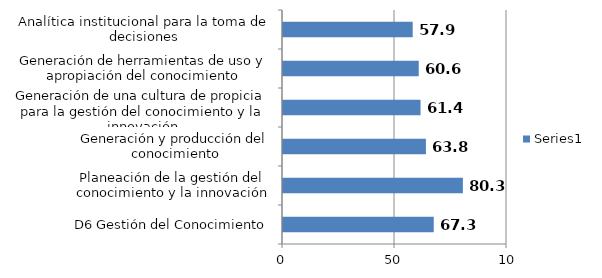
| Category | Series 0 |
|---|---|
| D6 Gestión del Conocimiento | 67.3 |
| Planeación de la gestión del conocimiento y la innovación | 80.3 |
| Generación y producción del conocimiento | 63.8 |
| Generación de una cultura de propicia para la gestión del conocimiento y la innovación | 61.4 |
| Generación de herramientas de uso y apropiación del conocimiento | 60.6 |
| Analítica institucional para la toma de decisiones | 57.9 |